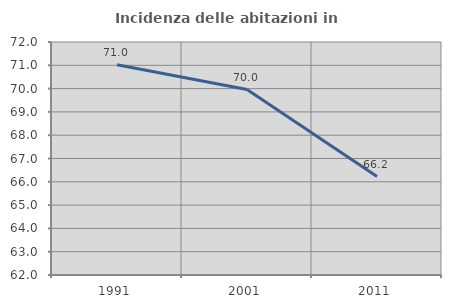
| Category | Incidenza delle abitazioni in proprietà  |
|---|---|
| 1991.0 | 71.021 |
| 2001.0 | 69.96 |
| 2011.0 | 66.226 |